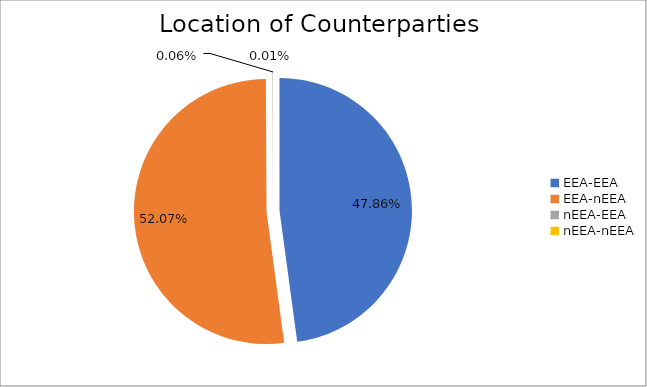
| Category | Series 0 |
|---|---|
| EEA-EEA | 5951809.279 |
| EEA-nEEA | 6474339.466 |
| nEEA-EEA | 7446.255 |
| nEEA-nEEA | 1031.505 |